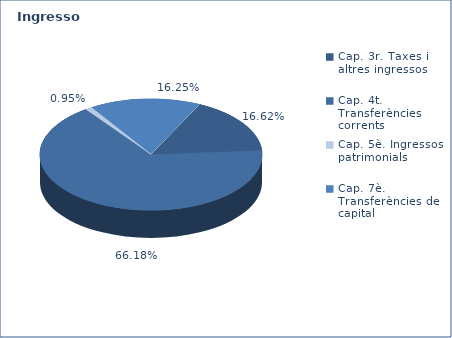
| Category | Series 0 |
|---|---|
| Cap. 3r. Taxes i altres ingressos | 57985949 |
| Cap. 4t. Transferències corrents | 230872613 |
| Cap. 5è. Ingressos patrimonials | 3308487 |
| Cap. 7è. Transferències de capital | 56696128 |
| Cap. 8è. Actius financers | 0 |
| Cap. 9è. Préstecs | 0 |